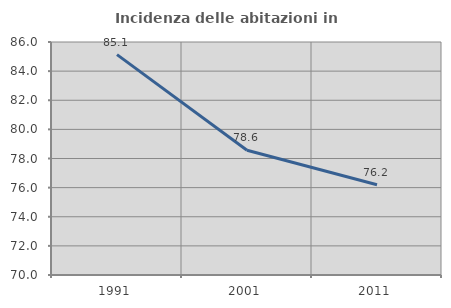
| Category | Incidenza delle abitazioni in proprietà  |
|---|---|
| 1991.0 | 85.133 |
| 2001.0 | 78.571 |
| 2011.0 | 76.199 |